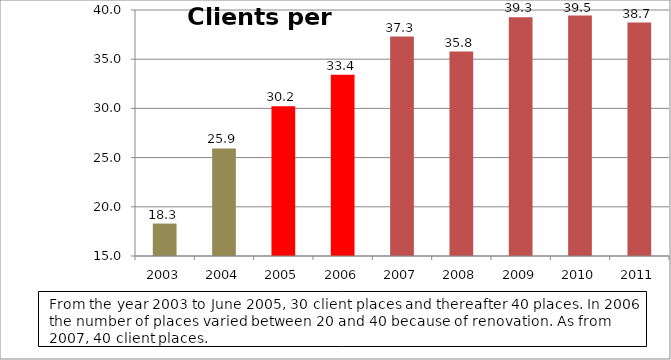
| Category | Asiakkaita per vrk |
|---|---|
| 2003.0 | 18.296 |
| 2004.0 | 25.937 |
| 2005.0 | 30.208 |
| 2006.0 | 33.414 |
| 2007.0 | 37.304 |
| 2008.0 | 35.77 |
| 2009.0 | 39.26 |
| 2010.0 | 39.452 |
| 2011.0 | 38.721 |